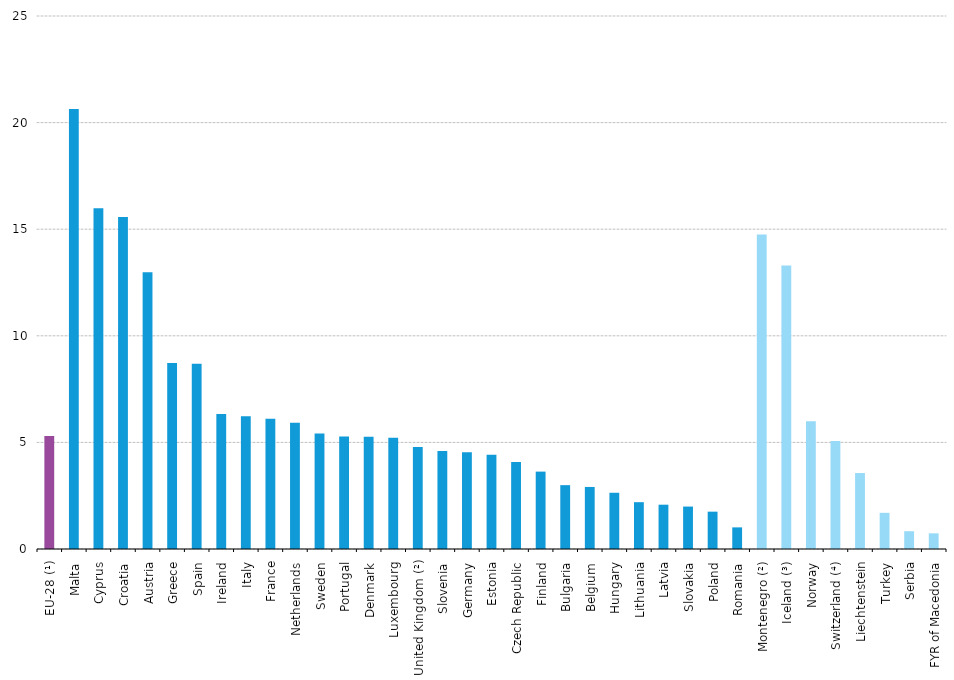
| Category | Series 0 |
|---|---|
| EU-28 (¹) | 5.295 |
| Malta | 20.642 |
| Cyprus | 15.985 |
| Croatia | 15.571 |
| Austria | 12.983 |
| Greece | 8.723 |
| Spain | 8.685 |
| Ireland | 6.333 |
| Italy | 6.222 |
| France | 6.111 |
| Netherlands | 5.927 |
| Sweden | 5.421 |
| Portugal | 5.273 |
| Denmark | 5.268 |
| Luxembourg | 5.217 |
| United Kingdom (²) | 4.781 |
| Slovenia | 4.595 |
| Germany | 4.538 |
| Estonia | 4.415 |
| Czech Republic | 4.085 |
| Finland | 3.63 |
| Bulgaria | 2.995 |
| Belgium | 2.91 |
| Hungary | 2.638 |
| Lithuania | 2.196 |
| Latvia | 2.078 |
| Slovakia | 1.991 |
| Poland | 1.751 |
| Romania | 1.014 |
| Montenegro (²) | 14.753 |
| Iceland (³) | 13.3 |
| Norway | 5.993 |
| Switzerland (⁴) | 5.071 |
| Liechtenstein | 3.562 |
| Turkey | 1.696 |
| Serbia | 0.833 |
| FYR of Macedonia | 0.735 |